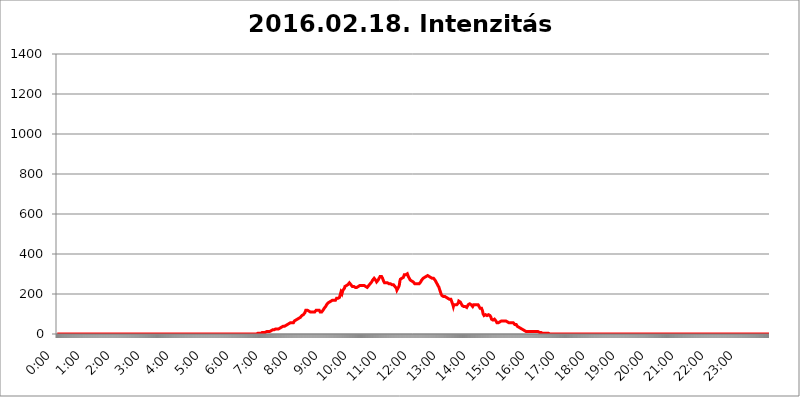
| Category | 2016.02.18. Intenzitás [W/m^2] |
|---|---|
| 0.0 | 0 |
| 0.0006944444444444445 | 0 |
| 0.001388888888888889 | 0 |
| 0.0020833333333333333 | 0 |
| 0.002777777777777778 | 0 |
| 0.003472222222222222 | 0 |
| 0.004166666666666667 | 0 |
| 0.004861111111111111 | 0 |
| 0.005555555555555556 | 0 |
| 0.0062499999999999995 | 0 |
| 0.006944444444444444 | 0 |
| 0.007638888888888889 | 0 |
| 0.008333333333333333 | 0 |
| 0.009027777777777779 | 0 |
| 0.009722222222222222 | 0 |
| 0.010416666666666666 | 0 |
| 0.011111111111111112 | 0 |
| 0.011805555555555555 | 0 |
| 0.012499999999999999 | 0 |
| 0.013194444444444444 | 0 |
| 0.013888888888888888 | 0 |
| 0.014583333333333332 | 0 |
| 0.015277777777777777 | 0 |
| 0.015972222222222224 | 0 |
| 0.016666666666666666 | 0 |
| 0.017361111111111112 | 0 |
| 0.018055555555555557 | 0 |
| 0.01875 | 0 |
| 0.019444444444444445 | 0 |
| 0.02013888888888889 | 0 |
| 0.020833333333333332 | 0 |
| 0.02152777777777778 | 0 |
| 0.022222222222222223 | 0 |
| 0.02291666666666667 | 0 |
| 0.02361111111111111 | 0 |
| 0.024305555555555556 | 0 |
| 0.024999999999999998 | 0 |
| 0.025694444444444447 | 0 |
| 0.02638888888888889 | 0 |
| 0.027083333333333334 | 0 |
| 0.027777777777777776 | 0 |
| 0.02847222222222222 | 0 |
| 0.029166666666666664 | 0 |
| 0.029861111111111113 | 0 |
| 0.030555555555555555 | 0 |
| 0.03125 | 0 |
| 0.03194444444444445 | 0 |
| 0.03263888888888889 | 0 |
| 0.03333333333333333 | 0 |
| 0.034027777777777775 | 0 |
| 0.034722222222222224 | 0 |
| 0.035416666666666666 | 0 |
| 0.036111111111111115 | 0 |
| 0.03680555555555556 | 0 |
| 0.0375 | 0 |
| 0.03819444444444444 | 0 |
| 0.03888888888888889 | 0 |
| 0.03958333333333333 | 0 |
| 0.04027777777777778 | 0 |
| 0.04097222222222222 | 0 |
| 0.041666666666666664 | 0 |
| 0.042361111111111106 | 0 |
| 0.04305555555555556 | 0 |
| 0.043750000000000004 | 0 |
| 0.044444444444444446 | 0 |
| 0.04513888888888889 | 0 |
| 0.04583333333333334 | 0 |
| 0.04652777777777778 | 0 |
| 0.04722222222222222 | 0 |
| 0.04791666666666666 | 0 |
| 0.04861111111111111 | 0 |
| 0.049305555555555554 | 0 |
| 0.049999999999999996 | 0 |
| 0.05069444444444445 | 0 |
| 0.051388888888888894 | 0 |
| 0.052083333333333336 | 0 |
| 0.05277777777777778 | 0 |
| 0.05347222222222222 | 0 |
| 0.05416666666666667 | 0 |
| 0.05486111111111111 | 0 |
| 0.05555555555555555 | 0 |
| 0.05625 | 0 |
| 0.05694444444444444 | 0 |
| 0.057638888888888885 | 0 |
| 0.05833333333333333 | 0 |
| 0.05902777777777778 | 0 |
| 0.059722222222222225 | 0 |
| 0.06041666666666667 | 0 |
| 0.061111111111111116 | 0 |
| 0.06180555555555556 | 0 |
| 0.0625 | 0 |
| 0.06319444444444444 | 0 |
| 0.06388888888888888 | 0 |
| 0.06458333333333334 | 0 |
| 0.06527777777777778 | 0 |
| 0.06597222222222222 | 0 |
| 0.06666666666666667 | 0 |
| 0.06736111111111111 | 0 |
| 0.06805555555555555 | 0 |
| 0.06874999999999999 | 0 |
| 0.06944444444444443 | 0 |
| 0.07013888888888889 | 0 |
| 0.07083333333333333 | 0 |
| 0.07152777777777779 | 0 |
| 0.07222222222222223 | 0 |
| 0.07291666666666667 | 0 |
| 0.07361111111111111 | 0 |
| 0.07430555555555556 | 0 |
| 0.075 | 0 |
| 0.07569444444444444 | 0 |
| 0.0763888888888889 | 0 |
| 0.07708333333333334 | 0 |
| 0.07777777777777778 | 0 |
| 0.07847222222222222 | 0 |
| 0.07916666666666666 | 0 |
| 0.0798611111111111 | 0 |
| 0.08055555555555556 | 0 |
| 0.08125 | 0 |
| 0.08194444444444444 | 0 |
| 0.08263888888888889 | 0 |
| 0.08333333333333333 | 0 |
| 0.08402777777777777 | 0 |
| 0.08472222222222221 | 0 |
| 0.08541666666666665 | 0 |
| 0.08611111111111112 | 0 |
| 0.08680555555555557 | 0 |
| 0.08750000000000001 | 0 |
| 0.08819444444444445 | 0 |
| 0.08888888888888889 | 0 |
| 0.08958333333333333 | 0 |
| 0.09027777777777778 | 0 |
| 0.09097222222222222 | 0 |
| 0.09166666666666667 | 0 |
| 0.09236111111111112 | 0 |
| 0.09305555555555556 | 0 |
| 0.09375 | 0 |
| 0.09444444444444444 | 0 |
| 0.09513888888888888 | 0 |
| 0.09583333333333333 | 0 |
| 0.09652777777777777 | 0 |
| 0.09722222222222222 | 0 |
| 0.09791666666666667 | 0 |
| 0.09861111111111111 | 0 |
| 0.09930555555555555 | 0 |
| 0.09999999999999999 | 0 |
| 0.10069444444444443 | 0 |
| 0.1013888888888889 | 0 |
| 0.10208333333333335 | 0 |
| 0.10277777777777779 | 0 |
| 0.10347222222222223 | 0 |
| 0.10416666666666667 | 0 |
| 0.10486111111111111 | 0 |
| 0.10555555555555556 | 0 |
| 0.10625 | 0 |
| 0.10694444444444444 | 0 |
| 0.1076388888888889 | 0 |
| 0.10833333333333334 | 0 |
| 0.10902777777777778 | 0 |
| 0.10972222222222222 | 0 |
| 0.1111111111111111 | 0 |
| 0.11180555555555556 | 0 |
| 0.11180555555555556 | 0 |
| 0.1125 | 0 |
| 0.11319444444444444 | 0 |
| 0.11388888888888889 | 0 |
| 0.11458333333333333 | 0 |
| 0.11527777777777777 | 0 |
| 0.11597222222222221 | 0 |
| 0.11666666666666665 | 0 |
| 0.1173611111111111 | 0 |
| 0.11805555555555557 | 0 |
| 0.11944444444444445 | 0 |
| 0.12013888888888889 | 0 |
| 0.12083333333333333 | 0 |
| 0.12152777777777778 | 0 |
| 0.12222222222222223 | 0 |
| 0.12291666666666667 | 0 |
| 0.12291666666666667 | 0 |
| 0.12361111111111112 | 0 |
| 0.12430555555555556 | 0 |
| 0.125 | 0 |
| 0.12569444444444444 | 0 |
| 0.12638888888888888 | 0 |
| 0.12708333333333333 | 0 |
| 0.16875 | 0 |
| 0.12847222222222224 | 0 |
| 0.12916666666666668 | 0 |
| 0.12986111111111112 | 0 |
| 0.13055555555555556 | 0 |
| 0.13125 | 0 |
| 0.13194444444444445 | 0 |
| 0.1326388888888889 | 0 |
| 0.13333333333333333 | 0 |
| 0.13402777777777777 | 0 |
| 0.13402777777777777 | 0 |
| 0.13472222222222222 | 0 |
| 0.13541666666666666 | 0 |
| 0.1361111111111111 | 0 |
| 0.13749999999999998 | 0 |
| 0.13819444444444443 | 0 |
| 0.1388888888888889 | 0 |
| 0.13958333333333334 | 0 |
| 0.14027777777777778 | 0 |
| 0.14097222222222222 | 0 |
| 0.14166666666666666 | 0 |
| 0.1423611111111111 | 0 |
| 0.14305555555555557 | 0 |
| 0.14375000000000002 | 0 |
| 0.14444444444444446 | 0 |
| 0.1451388888888889 | 0 |
| 0.1451388888888889 | 0 |
| 0.14652777777777778 | 0 |
| 0.14722222222222223 | 0 |
| 0.14791666666666667 | 0 |
| 0.1486111111111111 | 0 |
| 0.14930555555555555 | 0 |
| 0.15 | 0 |
| 0.15069444444444444 | 0 |
| 0.15138888888888888 | 0 |
| 0.15208333333333332 | 0 |
| 0.15277777777777776 | 0 |
| 0.15347222222222223 | 0 |
| 0.15416666666666667 | 0 |
| 0.15486111111111112 | 0 |
| 0.15555555555555556 | 0 |
| 0.15625 | 0 |
| 0.15694444444444444 | 0 |
| 0.15763888888888888 | 0 |
| 0.15833333333333333 | 0 |
| 0.15902777777777777 | 0 |
| 0.15972222222222224 | 0 |
| 0.16041666666666668 | 0 |
| 0.16111111111111112 | 0 |
| 0.16180555555555556 | 0 |
| 0.1625 | 0 |
| 0.16319444444444445 | 0 |
| 0.1638888888888889 | 0 |
| 0.16458333333333333 | 0 |
| 0.16527777777777777 | 0 |
| 0.16597222222222222 | 0 |
| 0.16666666666666666 | 0 |
| 0.1673611111111111 | 0 |
| 0.16805555555555554 | 0 |
| 0.16874999999999998 | 0 |
| 0.16944444444444443 | 0 |
| 0.17013888888888887 | 0 |
| 0.1708333333333333 | 0 |
| 0.17152777777777775 | 0 |
| 0.17222222222222225 | 0 |
| 0.1729166666666667 | 0 |
| 0.17361111111111113 | 0 |
| 0.17430555555555557 | 0 |
| 0.17500000000000002 | 0 |
| 0.17569444444444446 | 0 |
| 0.1763888888888889 | 0 |
| 0.17708333333333334 | 0 |
| 0.17777777777777778 | 0 |
| 0.17847222222222223 | 0 |
| 0.17916666666666667 | 0 |
| 0.1798611111111111 | 0 |
| 0.18055555555555555 | 0 |
| 0.18125 | 0 |
| 0.18194444444444444 | 0 |
| 0.1826388888888889 | 0 |
| 0.18333333333333335 | 0 |
| 0.1840277777777778 | 0 |
| 0.18472222222222223 | 0 |
| 0.18541666666666667 | 0 |
| 0.18611111111111112 | 0 |
| 0.18680555555555556 | 0 |
| 0.1875 | 0 |
| 0.18819444444444444 | 0 |
| 0.18888888888888888 | 0 |
| 0.18958333333333333 | 0 |
| 0.19027777777777777 | 0 |
| 0.1909722222222222 | 0 |
| 0.19166666666666665 | 0 |
| 0.19236111111111112 | 0 |
| 0.19305555555555554 | 0 |
| 0.19375 | 0 |
| 0.19444444444444445 | 0 |
| 0.1951388888888889 | 0 |
| 0.19583333333333333 | 0 |
| 0.19652777777777777 | 0 |
| 0.19722222222222222 | 0 |
| 0.19791666666666666 | 0 |
| 0.1986111111111111 | 0 |
| 0.19930555555555554 | 0 |
| 0.19999999999999998 | 0 |
| 0.20069444444444443 | 0 |
| 0.20138888888888887 | 0 |
| 0.2020833333333333 | 0 |
| 0.2027777777777778 | 0 |
| 0.2034722222222222 | 0 |
| 0.2041666666666667 | 0 |
| 0.20486111111111113 | 0 |
| 0.20555555555555557 | 0 |
| 0.20625000000000002 | 0 |
| 0.20694444444444446 | 0 |
| 0.2076388888888889 | 0 |
| 0.20833333333333334 | 0 |
| 0.20902777777777778 | 0 |
| 0.20972222222222223 | 0 |
| 0.21041666666666667 | 0 |
| 0.2111111111111111 | 0 |
| 0.21180555555555555 | 0 |
| 0.2125 | 0 |
| 0.21319444444444444 | 0 |
| 0.2138888888888889 | 0 |
| 0.21458333333333335 | 0 |
| 0.2152777777777778 | 0 |
| 0.21597222222222223 | 0 |
| 0.21666666666666667 | 0 |
| 0.21736111111111112 | 0 |
| 0.21805555555555556 | 0 |
| 0.21875 | 0 |
| 0.21944444444444444 | 0 |
| 0.22013888888888888 | 0 |
| 0.22083333333333333 | 0 |
| 0.22152777777777777 | 0 |
| 0.2222222222222222 | 0 |
| 0.22291666666666665 | 0 |
| 0.2236111111111111 | 0 |
| 0.22430555555555556 | 0 |
| 0.225 | 0 |
| 0.22569444444444445 | 0 |
| 0.2263888888888889 | 0 |
| 0.22708333333333333 | 0 |
| 0.22777777777777777 | 0 |
| 0.22847222222222222 | 0 |
| 0.22916666666666666 | 0 |
| 0.2298611111111111 | 0 |
| 0.23055555555555554 | 0 |
| 0.23124999999999998 | 0 |
| 0.23194444444444443 | 0 |
| 0.23263888888888887 | 0 |
| 0.2333333333333333 | 0 |
| 0.2340277777777778 | 0 |
| 0.2347222222222222 | 0 |
| 0.2354166666666667 | 0 |
| 0.23611111111111113 | 0 |
| 0.23680555555555557 | 0 |
| 0.23750000000000002 | 0 |
| 0.23819444444444446 | 0 |
| 0.2388888888888889 | 0 |
| 0.23958333333333334 | 0 |
| 0.24027777777777778 | 0 |
| 0.24097222222222223 | 0 |
| 0.24166666666666667 | 0 |
| 0.2423611111111111 | 0 |
| 0.24305555555555555 | 0 |
| 0.24375 | 0 |
| 0.24444444444444446 | 0 |
| 0.24513888888888888 | 0 |
| 0.24583333333333335 | 0 |
| 0.2465277777777778 | 0 |
| 0.24722222222222223 | 0 |
| 0.24791666666666667 | 0 |
| 0.24861111111111112 | 0 |
| 0.24930555555555556 | 0 |
| 0.25 | 0 |
| 0.25069444444444444 | 0 |
| 0.2513888888888889 | 0 |
| 0.2520833333333333 | 0 |
| 0.25277777777777777 | 0 |
| 0.2534722222222222 | 0 |
| 0.25416666666666665 | 0 |
| 0.2548611111111111 | 0 |
| 0.2555555555555556 | 0 |
| 0.25625000000000003 | 0 |
| 0.2569444444444445 | 0 |
| 0.2576388888888889 | 0 |
| 0.25833333333333336 | 0 |
| 0.2590277777777778 | 0 |
| 0.25972222222222224 | 0 |
| 0.2604166666666667 | 0 |
| 0.2611111111111111 | 0 |
| 0.26180555555555557 | 0 |
| 0.2625 | 0 |
| 0.26319444444444445 | 0 |
| 0.2638888888888889 | 0 |
| 0.26458333333333334 | 0 |
| 0.2652777777777778 | 0 |
| 0.2659722222222222 | 0 |
| 0.26666666666666666 | 0 |
| 0.2673611111111111 | 0 |
| 0.26805555555555555 | 0 |
| 0.26875 | 0 |
| 0.26944444444444443 | 0 |
| 0.2701388888888889 | 0 |
| 0.2708333333333333 | 0 |
| 0.27152777777777776 | 0 |
| 0.2722222222222222 | 0 |
| 0.27291666666666664 | 0 |
| 0.2736111111111111 | 0 |
| 0.2743055555555555 | 0 |
| 0.27499999999999997 | 0 |
| 0.27569444444444446 | 0 |
| 0.27638888888888885 | 0 |
| 0.27708333333333335 | 0 |
| 0.2777777777777778 | 0 |
| 0.27847222222222223 | 0 |
| 0.2791666666666667 | 0 |
| 0.2798611111111111 | 0 |
| 0.28055555555555556 | 3.525 |
| 0.28125 | 3.525 |
| 0.28194444444444444 | 3.525 |
| 0.2826388888888889 | 3.525 |
| 0.2833333333333333 | 3.525 |
| 0.28402777777777777 | 3.525 |
| 0.2847222222222222 | 3.525 |
| 0.28541666666666665 | 3.525 |
| 0.28611111111111115 | 3.525 |
| 0.28680555555555554 | 7.887 |
| 0.28750000000000003 | 7.887 |
| 0.2881944444444445 | 7.887 |
| 0.2888888888888889 | 7.887 |
| 0.28958333333333336 | 7.887 |
| 0.2902777777777778 | 7.887 |
| 0.29097222222222224 | 7.887 |
| 0.2916666666666667 | 7.887 |
| 0.2923611111111111 | 7.887 |
| 0.29305555555555557 | 7.887 |
| 0.29375 | 12.257 |
| 0.29444444444444445 | 12.257 |
| 0.2951388888888889 | 12.257 |
| 0.29583333333333334 | 12.257 |
| 0.2965277777777778 | 12.257 |
| 0.2972222222222222 | 12.257 |
| 0.29791666666666666 | 12.257 |
| 0.2986111111111111 | 16.636 |
| 0.29930555555555555 | 16.636 |
| 0.3 | 16.636 |
| 0.30069444444444443 | 16.636 |
| 0.3013888888888889 | 16.636 |
| 0.3020833333333333 | 21.024 |
| 0.30277777777777776 | 21.024 |
| 0.3034722222222222 | 21.024 |
| 0.30416666666666664 | 21.024 |
| 0.3048611111111111 | 25.419 |
| 0.3055555555555555 | 25.419 |
| 0.30624999999999997 | 25.419 |
| 0.3069444444444444 | 25.419 |
| 0.3076388888888889 | 25.419 |
| 0.30833333333333335 | 25.419 |
| 0.3090277777777778 | 25.419 |
| 0.30972222222222223 | 25.419 |
| 0.3104166666666667 | 25.419 |
| 0.3111111111111111 | 25.419 |
| 0.31180555555555556 | 29.823 |
| 0.3125 | 29.823 |
| 0.31319444444444444 | 29.823 |
| 0.3138888888888889 | 29.823 |
| 0.3145833333333333 | 34.234 |
| 0.31527777777777777 | 34.234 |
| 0.3159722222222222 | 34.234 |
| 0.31666666666666665 | 38.653 |
| 0.31736111111111115 | 38.653 |
| 0.31805555555555554 | 38.653 |
| 0.31875000000000003 | 38.653 |
| 0.3194444444444445 | 38.653 |
| 0.3201388888888889 | 43.079 |
| 0.32083333333333336 | 43.079 |
| 0.3215277777777778 | 43.079 |
| 0.32222222222222224 | 47.511 |
| 0.3229166666666667 | 47.511 |
| 0.3236111111111111 | 47.511 |
| 0.32430555555555557 | 51.951 |
| 0.325 | 51.951 |
| 0.32569444444444445 | 51.951 |
| 0.3263888888888889 | 56.398 |
| 0.32708333333333334 | 56.398 |
| 0.3277777777777778 | 56.398 |
| 0.3284722222222222 | 56.398 |
| 0.32916666666666666 | 56.398 |
| 0.3298611111111111 | 56.398 |
| 0.33055555555555555 | 56.398 |
| 0.33125 | 56.398 |
| 0.33194444444444443 | 60.85 |
| 0.3326388888888889 | 65.31 |
| 0.3333333333333333 | 65.31 |
| 0.3340277777777778 | 65.31 |
| 0.3347222222222222 | 69.775 |
| 0.3354166666666667 | 69.775 |
| 0.3361111111111111 | 69.775 |
| 0.3368055555555556 | 74.246 |
| 0.33749999999999997 | 74.246 |
| 0.33819444444444446 | 74.246 |
| 0.33888888888888885 | 78.722 |
| 0.33958333333333335 | 78.722 |
| 0.34027777777777773 | 83.205 |
| 0.34097222222222223 | 83.205 |
| 0.3416666666666666 | 87.692 |
| 0.3423611111111111 | 87.692 |
| 0.3430555555555555 | 92.184 |
| 0.34375 | 92.184 |
| 0.3444444444444445 | 96.682 |
| 0.3451388888888889 | 96.682 |
| 0.3458333333333334 | 101.184 |
| 0.34652777777777777 | 101.184 |
| 0.34722222222222227 | 105.69 |
| 0.34791666666666665 | 110.201 |
| 0.34861111111111115 | 119.235 |
| 0.34930555555555554 | 119.235 |
| 0.35000000000000003 | 119.235 |
| 0.3506944444444444 | 119.235 |
| 0.3513888888888889 | 119.235 |
| 0.3520833333333333 | 119.235 |
| 0.3527777777777778 | 114.716 |
| 0.3534722222222222 | 114.716 |
| 0.3541666666666667 | 110.201 |
| 0.3548611111111111 | 110.201 |
| 0.35555555555555557 | 114.716 |
| 0.35625 | 110.201 |
| 0.35694444444444445 | 110.201 |
| 0.3576388888888889 | 110.201 |
| 0.35833333333333334 | 110.201 |
| 0.3590277777777778 | 110.201 |
| 0.3597222222222222 | 110.201 |
| 0.36041666666666666 | 110.201 |
| 0.3611111111111111 | 110.201 |
| 0.36180555555555555 | 114.716 |
| 0.3625 | 114.716 |
| 0.36319444444444443 | 119.235 |
| 0.3638888888888889 | 119.235 |
| 0.3645833333333333 | 119.235 |
| 0.3652777777777778 | 119.235 |
| 0.3659722222222222 | 119.235 |
| 0.3666666666666667 | 119.235 |
| 0.3673611111111111 | 119.235 |
| 0.3680555555555556 | 114.716 |
| 0.36874999999999997 | 110.201 |
| 0.36944444444444446 | 110.201 |
| 0.37013888888888885 | 110.201 |
| 0.37083333333333335 | 110.201 |
| 0.37152777777777773 | 114.716 |
| 0.37222222222222223 | 114.716 |
| 0.3729166666666666 | 119.235 |
| 0.3736111111111111 | 123.758 |
| 0.3743055555555555 | 128.284 |
| 0.375 | 128.284 |
| 0.3756944444444445 | 132.814 |
| 0.3763888888888889 | 137.347 |
| 0.3770833333333334 | 141.884 |
| 0.37777777777777777 | 146.423 |
| 0.37847222222222227 | 146.423 |
| 0.37916666666666665 | 150.964 |
| 0.37986111111111115 | 155.509 |
| 0.38055555555555554 | 155.509 |
| 0.38125000000000003 | 160.056 |
| 0.3819444444444444 | 160.056 |
| 0.3826388888888889 | 164.605 |
| 0.3833333333333333 | 164.605 |
| 0.3840277777777778 | 164.605 |
| 0.3847222222222222 | 164.605 |
| 0.3854166666666667 | 169.156 |
| 0.3861111111111111 | 169.156 |
| 0.38680555555555557 | 169.156 |
| 0.3875 | 169.156 |
| 0.38819444444444445 | 169.156 |
| 0.3888888888888889 | 169.156 |
| 0.38958333333333334 | 169.156 |
| 0.3902777777777778 | 169.156 |
| 0.3909722222222222 | 173.709 |
| 0.39166666666666666 | 178.264 |
| 0.3923611111111111 | 182.82 |
| 0.39305555555555555 | 182.82 |
| 0.39375 | 178.264 |
| 0.39444444444444443 | 178.264 |
| 0.3951388888888889 | 182.82 |
| 0.3958333333333333 | 182.82 |
| 0.3965277777777778 | 191.937 |
| 0.3972222222222222 | 201.058 |
| 0.3979166666666667 | 210.182 |
| 0.3986111111111111 | 205.62 |
| 0.3993055555555556 | 201.058 |
| 0.39999999999999997 | 205.62 |
| 0.40069444444444446 | 219.309 |
| 0.40138888888888885 | 219.309 |
| 0.40208333333333335 | 223.873 |
| 0.40277777777777773 | 228.436 |
| 0.40347222222222223 | 237.564 |
| 0.4041666666666666 | 242.127 |
| 0.4048611111111111 | 242.127 |
| 0.4055555555555555 | 242.127 |
| 0.40625 | 242.127 |
| 0.4069444444444445 | 242.127 |
| 0.4076388888888889 | 246.689 |
| 0.4083333333333334 | 246.689 |
| 0.40902777777777777 | 251.251 |
| 0.40972222222222227 | 255.813 |
| 0.41041666666666665 | 251.251 |
| 0.41111111111111115 | 251.251 |
| 0.41180555555555554 | 246.689 |
| 0.41250000000000003 | 242.127 |
| 0.4131944444444444 | 242.127 |
| 0.4138888888888889 | 237.564 |
| 0.4145833333333333 | 242.127 |
| 0.4152777777777778 | 237.564 |
| 0.4159722222222222 | 237.564 |
| 0.4166666666666667 | 233 |
| 0.4173611111111111 | 233 |
| 0.41805555555555557 | 233 |
| 0.41875 | 233 |
| 0.41944444444444445 | 233 |
| 0.4201388888888889 | 233 |
| 0.42083333333333334 | 237.564 |
| 0.4215277777777778 | 237.564 |
| 0.4222222222222222 | 237.564 |
| 0.42291666666666666 | 237.564 |
| 0.4236111111111111 | 237.564 |
| 0.42430555555555555 | 242.127 |
| 0.425 | 242.127 |
| 0.42569444444444443 | 242.127 |
| 0.4263888888888889 | 242.127 |
| 0.4270833333333333 | 242.127 |
| 0.4277777777777778 | 242.127 |
| 0.4284722222222222 | 242.127 |
| 0.4291666666666667 | 242.127 |
| 0.4298611111111111 | 242.127 |
| 0.4305555555555556 | 242.127 |
| 0.43124999999999997 | 237.564 |
| 0.43194444444444446 | 237.564 |
| 0.43263888888888885 | 237.564 |
| 0.43333333333333335 | 237.564 |
| 0.43402777777777773 | 237.564 |
| 0.43472222222222223 | 233 |
| 0.4354166666666666 | 233 |
| 0.4361111111111111 | 233 |
| 0.4368055555555555 | 242.127 |
| 0.4375 | 242.127 |
| 0.4381944444444445 | 246.689 |
| 0.4388888888888889 | 251.251 |
| 0.4395833333333334 | 251.251 |
| 0.44027777777777777 | 255.813 |
| 0.44097222222222227 | 260.373 |
| 0.44166666666666665 | 260.373 |
| 0.44236111111111115 | 269.49 |
| 0.44305555555555554 | 269.49 |
| 0.44375000000000003 | 274.047 |
| 0.4444444444444444 | 278.603 |
| 0.4451388888888889 | 274.047 |
| 0.4458333333333333 | 274.047 |
| 0.4465277777777778 | 269.49 |
| 0.4472222222222222 | 264.932 |
| 0.4479166666666667 | 260.373 |
| 0.4486111111111111 | 260.373 |
| 0.44930555555555557 | 264.932 |
| 0.45 | 269.49 |
| 0.45069444444444445 | 269.49 |
| 0.4513888888888889 | 278.603 |
| 0.45208333333333334 | 283.156 |
| 0.4527777777777778 | 287.709 |
| 0.4534722222222222 | 287.709 |
| 0.45416666666666666 | 292.259 |
| 0.4548611111111111 | 287.709 |
| 0.45555555555555555 | 283.156 |
| 0.45625 | 278.603 |
| 0.45694444444444443 | 274.047 |
| 0.4576388888888889 | 264.932 |
| 0.4583333333333333 | 260.373 |
| 0.4590277777777778 | 255.813 |
| 0.4597222222222222 | 251.251 |
| 0.4604166666666667 | 251.251 |
| 0.4611111111111111 | 255.813 |
| 0.4618055555555556 | 255.813 |
| 0.46249999999999997 | 255.813 |
| 0.46319444444444446 | 255.813 |
| 0.46388888888888885 | 255.813 |
| 0.46458333333333335 | 255.813 |
| 0.46527777777777773 | 251.251 |
| 0.46597222222222223 | 251.251 |
| 0.4666666666666666 | 251.251 |
| 0.4673611111111111 | 251.251 |
| 0.4680555555555555 | 251.251 |
| 0.46875 | 251.251 |
| 0.4694444444444445 | 246.689 |
| 0.4701388888888889 | 246.689 |
| 0.4708333333333334 | 246.689 |
| 0.47152777777777777 | 246.689 |
| 0.47222222222222227 | 242.127 |
| 0.47291666666666665 | 242.127 |
| 0.47361111111111115 | 237.564 |
| 0.47430555555555554 | 233 |
| 0.47500000000000003 | 233 |
| 0.4756944444444444 | 228.436 |
| 0.4763888888888889 | 219.309 |
| 0.4770833333333333 | 223.873 |
| 0.4777777777777778 | 228.436 |
| 0.4784722222222222 | 228.436 |
| 0.4791666666666667 | 237.564 |
| 0.4798611111111111 | 246.689 |
| 0.48055555555555557 | 264.932 |
| 0.48125 | 274.047 |
| 0.48194444444444445 | 274.047 |
| 0.4826388888888889 | 278.603 |
| 0.48333333333333334 | 278.603 |
| 0.4840277777777778 | 278.603 |
| 0.4847222222222222 | 278.603 |
| 0.48541666666666666 | 283.156 |
| 0.4861111111111111 | 287.709 |
| 0.48680555555555555 | 296.808 |
| 0.4875 | 301.354 |
| 0.48819444444444443 | 296.808 |
| 0.4888888888888889 | 296.808 |
| 0.4895833333333333 | 296.808 |
| 0.4902777777777778 | 296.808 |
| 0.4909722222222222 | 301.354 |
| 0.4916666666666667 | 296.808 |
| 0.4923611111111111 | 287.709 |
| 0.4930555555555556 | 283.156 |
| 0.49374999999999997 | 278.603 |
| 0.49444444444444446 | 274.047 |
| 0.49513888888888885 | 269.49 |
| 0.49583333333333335 | 269.49 |
| 0.49652777777777773 | 269.49 |
| 0.49722222222222223 | 264.932 |
| 0.4979166666666666 | 260.373 |
| 0.4986111111111111 | 260.373 |
| 0.4993055555555555 | 260.373 |
| 0.5 | 255.813 |
| 0.5006944444444444 | 255.813 |
| 0.5013888888888889 | 251.251 |
| 0.5020833333333333 | 251.251 |
| 0.5027777777777778 | 251.251 |
| 0.5034722222222222 | 251.251 |
| 0.5041666666666667 | 251.251 |
| 0.5048611111111111 | 251.251 |
| 0.5055555555555555 | 251.251 |
| 0.50625 | 251.251 |
| 0.5069444444444444 | 251.251 |
| 0.5076388888888889 | 251.251 |
| 0.5083333333333333 | 251.251 |
| 0.5090277777777777 | 255.813 |
| 0.5097222222222222 | 260.373 |
| 0.5104166666666666 | 264.932 |
| 0.5111111111111112 | 269.49 |
| 0.5118055555555555 | 274.047 |
| 0.5125000000000001 | 274.047 |
| 0.5131944444444444 | 278.603 |
| 0.513888888888889 | 278.603 |
| 0.5145833333333333 | 278.603 |
| 0.5152777777777778 | 283.156 |
| 0.5159722222222222 | 283.156 |
| 0.5166666666666667 | 283.156 |
| 0.517361111111111 | 287.709 |
| 0.5180555555555556 | 287.709 |
| 0.5187499999999999 | 287.709 |
| 0.5194444444444445 | 292.259 |
| 0.5201388888888888 | 292.259 |
| 0.5208333333333334 | 287.709 |
| 0.5215277777777778 | 287.709 |
| 0.5222222222222223 | 283.156 |
| 0.5229166666666667 | 283.156 |
| 0.5236111111111111 | 283.156 |
| 0.5243055555555556 | 278.603 |
| 0.525 | 278.603 |
| 0.5256944444444445 | 278.603 |
| 0.5263888888888889 | 274.047 |
| 0.5270833333333333 | 278.603 |
| 0.5277777777777778 | 278.603 |
| 0.5284722222222222 | 274.047 |
| 0.5291666666666667 | 274.047 |
| 0.5298611111111111 | 269.49 |
| 0.5305555555555556 | 264.932 |
| 0.53125 | 260.373 |
| 0.5319444444444444 | 255.813 |
| 0.5326388888888889 | 251.251 |
| 0.5333333333333333 | 246.689 |
| 0.5340277777777778 | 242.127 |
| 0.5347222222222222 | 237.564 |
| 0.5354166666666667 | 233 |
| 0.5361111111111111 | 223.873 |
| 0.5368055555555555 | 219.309 |
| 0.5375 | 210.182 |
| 0.5381944444444444 | 201.058 |
| 0.5388888888888889 | 196.497 |
| 0.5395833333333333 | 191.937 |
| 0.5402777777777777 | 191.937 |
| 0.5409722222222222 | 187.378 |
| 0.5416666666666666 | 187.378 |
| 0.5423611111111112 | 187.378 |
| 0.5430555555555555 | 187.378 |
| 0.5437500000000001 | 187.378 |
| 0.5444444444444444 | 187.378 |
| 0.545138888888889 | 187.378 |
| 0.5458333333333333 | 182.82 |
| 0.5465277777777778 | 182.82 |
| 0.5472222222222222 | 178.264 |
| 0.5479166666666667 | 178.264 |
| 0.548611111111111 | 173.709 |
| 0.5493055555555556 | 173.709 |
| 0.5499999999999999 | 173.709 |
| 0.5506944444444445 | 173.709 |
| 0.5513888888888888 | 173.709 |
| 0.5520833333333334 | 173.709 |
| 0.5527777777777778 | 169.156 |
| 0.5534722222222223 | 160.056 |
| 0.5541666666666667 | 155.509 |
| 0.5548611111111111 | 146.423 |
| 0.5555555555555556 | 137.347 |
| 0.55625 | 146.423 |
| 0.5569444444444445 | 150.964 |
| 0.5576388888888889 | 146.423 |
| 0.5583333333333333 | 146.423 |
| 0.5590277777777778 | 146.423 |
| 0.5597222222222222 | 146.423 |
| 0.5604166666666667 | 146.423 |
| 0.5611111111111111 | 146.423 |
| 0.5618055555555556 | 150.964 |
| 0.5625 | 155.509 |
| 0.5631944444444444 | 164.605 |
| 0.5638888888888889 | 164.605 |
| 0.5645833333333333 | 164.605 |
| 0.5652777777777778 | 160.056 |
| 0.5659722222222222 | 155.509 |
| 0.5666666666666667 | 150.964 |
| 0.5673611111111111 | 146.423 |
| 0.5680555555555555 | 141.884 |
| 0.56875 | 137.347 |
| 0.5694444444444444 | 137.347 |
| 0.5701388888888889 | 137.347 |
| 0.5708333333333333 | 137.347 |
| 0.5715277777777777 | 137.347 |
| 0.5722222222222222 | 137.347 |
| 0.5729166666666666 | 137.347 |
| 0.5736111111111112 | 137.347 |
| 0.5743055555555555 | 132.814 |
| 0.5750000000000001 | 132.814 |
| 0.5756944444444444 | 137.347 |
| 0.576388888888889 | 146.423 |
| 0.5770833333333333 | 150.964 |
| 0.5777777777777778 | 150.964 |
| 0.5784722222222222 | 150.964 |
| 0.5791666666666667 | 150.964 |
| 0.579861111111111 | 150.964 |
| 0.5805555555555556 | 146.423 |
| 0.5812499999999999 | 141.884 |
| 0.5819444444444445 | 141.884 |
| 0.5826388888888888 | 137.347 |
| 0.5833333333333334 | 141.884 |
| 0.5840277777777778 | 146.423 |
| 0.5847222222222223 | 146.423 |
| 0.5854166666666667 | 146.423 |
| 0.5861111111111111 | 146.423 |
| 0.5868055555555556 | 146.423 |
| 0.5875 | 146.423 |
| 0.5881944444444445 | 146.423 |
| 0.5888888888888889 | 146.423 |
| 0.5895833333333333 | 146.423 |
| 0.5902777777777778 | 146.423 |
| 0.5909722222222222 | 141.884 |
| 0.5916666666666667 | 137.347 |
| 0.5923611111111111 | 132.814 |
| 0.5930555555555556 | 128.284 |
| 0.59375 | 132.814 |
| 0.5944444444444444 | 128.284 |
| 0.5951388888888889 | 128.284 |
| 0.5958333333333333 | 123.758 |
| 0.5965277777777778 | 114.716 |
| 0.5972222222222222 | 101.184 |
| 0.5979166666666667 | 96.682 |
| 0.5986111111111111 | 92.184 |
| 0.5993055555555555 | 92.184 |
| 0.6 | 92.184 |
| 0.6006944444444444 | 96.682 |
| 0.6013888888888889 | 96.682 |
| 0.6020833333333333 | 92.184 |
| 0.6027777777777777 | 92.184 |
| 0.6034722222222222 | 92.184 |
| 0.6041666666666666 | 92.184 |
| 0.6048611111111112 | 96.682 |
| 0.6055555555555555 | 96.682 |
| 0.6062500000000001 | 96.682 |
| 0.6069444444444444 | 92.184 |
| 0.607638888888889 | 87.692 |
| 0.6083333333333333 | 83.205 |
| 0.6090277777777778 | 74.246 |
| 0.6097222222222222 | 74.246 |
| 0.6104166666666667 | 69.775 |
| 0.611111111111111 | 69.775 |
| 0.6118055555555556 | 69.775 |
| 0.6124999999999999 | 74.246 |
| 0.6131944444444445 | 74.246 |
| 0.6138888888888888 | 74.246 |
| 0.6145833333333334 | 69.775 |
| 0.6152777777777778 | 65.31 |
| 0.6159722222222223 | 60.85 |
| 0.6166666666666667 | 56.398 |
| 0.6173611111111111 | 56.398 |
| 0.6180555555555556 | 60.85 |
| 0.61875 | 56.398 |
| 0.6194444444444445 | 56.398 |
| 0.6201388888888889 | 60.85 |
| 0.6208333333333333 | 60.85 |
| 0.6215277777777778 | 60.85 |
| 0.6222222222222222 | 60.85 |
| 0.6229166666666667 | 65.31 |
| 0.6236111111111111 | 60.85 |
| 0.6243055555555556 | 60.85 |
| 0.625 | 65.31 |
| 0.6256944444444444 | 65.31 |
| 0.6263888888888889 | 65.31 |
| 0.6270833333333333 | 65.31 |
| 0.6277777777777778 | 65.31 |
| 0.6284722222222222 | 65.31 |
| 0.6291666666666667 | 65.31 |
| 0.6298611111111111 | 65.31 |
| 0.6305555555555555 | 60.85 |
| 0.63125 | 60.85 |
| 0.6319444444444444 | 56.398 |
| 0.6326388888888889 | 56.398 |
| 0.6333333333333333 | 56.398 |
| 0.6340277777777777 | 56.398 |
| 0.6347222222222222 | 56.398 |
| 0.6354166666666666 | 56.398 |
| 0.6361111111111112 | 56.398 |
| 0.6368055555555555 | 56.398 |
| 0.6375000000000001 | 56.398 |
| 0.6381944444444444 | 56.398 |
| 0.638888888888889 | 56.398 |
| 0.6395833333333333 | 56.398 |
| 0.6402777777777778 | 51.951 |
| 0.6409722222222222 | 51.951 |
| 0.6416666666666667 | 47.511 |
| 0.642361111111111 | 47.511 |
| 0.6430555555555556 | 47.511 |
| 0.6437499999999999 | 47.511 |
| 0.6444444444444445 | 43.079 |
| 0.6451388888888888 | 38.653 |
| 0.6458333333333334 | 38.653 |
| 0.6465277777777778 | 34.234 |
| 0.6472222222222223 | 34.234 |
| 0.6479166666666667 | 29.823 |
| 0.6486111111111111 | 29.823 |
| 0.6493055555555556 | 29.823 |
| 0.65 | 25.419 |
| 0.6506944444444445 | 25.419 |
| 0.6513888888888889 | 25.419 |
| 0.6520833333333333 | 21.024 |
| 0.6527777777777778 | 21.024 |
| 0.6534722222222222 | 21.024 |
| 0.6541666666666667 | 16.636 |
| 0.6548611111111111 | 16.636 |
| 0.6555555555555556 | 16.636 |
| 0.65625 | 12.257 |
| 0.6569444444444444 | 12.257 |
| 0.6576388888888889 | 12.257 |
| 0.6583333333333333 | 12.257 |
| 0.6590277777777778 | 12.257 |
| 0.6597222222222222 | 12.257 |
| 0.6604166666666667 | 12.257 |
| 0.6611111111111111 | 12.257 |
| 0.6618055555555555 | 12.257 |
| 0.6625 | 12.257 |
| 0.6631944444444444 | 12.257 |
| 0.6638888888888889 | 12.257 |
| 0.6645833333333333 | 12.257 |
| 0.6652777777777777 | 12.257 |
| 0.6659722222222222 | 12.257 |
| 0.6666666666666666 | 12.257 |
| 0.6673611111111111 | 12.257 |
| 0.6680555555555556 | 12.257 |
| 0.6687500000000001 | 12.257 |
| 0.6694444444444444 | 12.257 |
| 0.6701388888888888 | 12.257 |
| 0.6708333333333334 | 12.257 |
| 0.6715277777777778 | 12.257 |
| 0.6722222222222222 | 12.257 |
| 0.6729166666666666 | 12.257 |
| 0.6736111111111112 | 12.257 |
| 0.6743055555555556 | 12.257 |
| 0.6749999999999999 | 7.887 |
| 0.6756944444444444 | 7.887 |
| 0.6763888888888889 | 7.887 |
| 0.6770833333333334 | 7.887 |
| 0.6777777777777777 | 7.887 |
| 0.6784722222222223 | 7.887 |
| 0.6791666666666667 | 7.887 |
| 0.6798611111111111 | 3.525 |
| 0.6805555555555555 | 3.525 |
| 0.68125 | 3.525 |
| 0.6819444444444445 | 3.525 |
| 0.6826388888888889 | 3.525 |
| 0.6833333333333332 | 3.525 |
| 0.6840277777777778 | 3.525 |
| 0.6847222222222222 | 3.525 |
| 0.6854166666666667 | 3.525 |
| 0.686111111111111 | 3.525 |
| 0.6868055555555556 | 3.525 |
| 0.6875 | 3.525 |
| 0.6881944444444444 | 3.525 |
| 0.688888888888889 | 3.525 |
| 0.6895833333333333 | 3.525 |
| 0.6902777777777778 | 0 |
| 0.6909722222222222 | 0 |
| 0.6916666666666668 | 0 |
| 0.6923611111111111 | 0 |
| 0.6930555555555555 | 0 |
| 0.69375 | 0 |
| 0.6944444444444445 | 0 |
| 0.6951388888888889 | 0 |
| 0.6958333333333333 | 0 |
| 0.6965277777777777 | 0 |
| 0.6972222222222223 | 0 |
| 0.6979166666666666 | 0 |
| 0.6986111111111111 | 0 |
| 0.6993055555555556 | 0 |
| 0.7000000000000001 | 0 |
| 0.7006944444444444 | 0 |
| 0.7013888888888888 | 0 |
| 0.7020833333333334 | 0 |
| 0.7027777777777778 | 0 |
| 0.7034722222222222 | 0 |
| 0.7041666666666666 | 0 |
| 0.7048611111111112 | 0 |
| 0.7055555555555556 | 0 |
| 0.7062499999999999 | 0 |
| 0.7069444444444444 | 0 |
| 0.7076388888888889 | 0 |
| 0.7083333333333334 | 0 |
| 0.7090277777777777 | 0 |
| 0.7097222222222223 | 0 |
| 0.7104166666666667 | 0 |
| 0.7111111111111111 | 0 |
| 0.7118055555555555 | 0 |
| 0.7125 | 0 |
| 0.7131944444444445 | 0 |
| 0.7138888888888889 | 0 |
| 0.7145833333333332 | 0 |
| 0.7152777777777778 | 0 |
| 0.7159722222222222 | 0 |
| 0.7166666666666667 | 0 |
| 0.717361111111111 | 0 |
| 0.7180555555555556 | 0 |
| 0.71875 | 0 |
| 0.7194444444444444 | 0 |
| 0.720138888888889 | 0 |
| 0.7208333333333333 | 0 |
| 0.7215277777777778 | 0 |
| 0.7222222222222222 | 0 |
| 0.7229166666666668 | 0 |
| 0.7236111111111111 | 0 |
| 0.7243055555555555 | 0 |
| 0.725 | 0 |
| 0.7256944444444445 | 0 |
| 0.7263888888888889 | 0 |
| 0.7270833333333333 | 0 |
| 0.7277777777777777 | 0 |
| 0.7284722222222223 | 0 |
| 0.7291666666666666 | 0 |
| 0.7298611111111111 | 0 |
| 0.7305555555555556 | 0 |
| 0.7312500000000001 | 0 |
| 0.7319444444444444 | 0 |
| 0.7326388888888888 | 0 |
| 0.7333333333333334 | 0 |
| 0.7340277777777778 | 0 |
| 0.7347222222222222 | 0 |
| 0.7354166666666666 | 0 |
| 0.7361111111111112 | 0 |
| 0.7368055555555556 | 0 |
| 0.7374999999999999 | 0 |
| 0.7381944444444444 | 0 |
| 0.7388888888888889 | 0 |
| 0.7395833333333334 | 0 |
| 0.7402777777777777 | 0 |
| 0.7409722222222223 | 0 |
| 0.7416666666666667 | 0 |
| 0.7423611111111111 | 0 |
| 0.7430555555555555 | 0 |
| 0.74375 | 0 |
| 0.7444444444444445 | 0 |
| 0.7451388888888889 | 0 |
| 0.7458333333333332 | 0 |
| 0.7465277777777778 | 0 |
| 0.7472222222222222 | 0 |
| 0.7479166666666667 | 0 |
| 0.748611111111111 | 0 |
| 0.7493055555555556 | 0 |
| 0.75 | 0 |
| 0.7506944444444444 | 0 |
| 0.751388888888889 | 0 |
| 0.7520833333333333 | 0 |
| 0.7527777777777778 | 0 |
| 0.7534722222222222 | 0 |
| 0.7541666666666668 | 0 |
| 0.7548611111111111 | 0 |
| 0.7555555555555555 | 0 |
| 0.75625 | 0 |
| 0.7569444444444445 | 0 |
| 0.7576388888888889 | 0 |
| 0.7583333333333333 | 0 |
| 0.7590277777777777 | 0 |
| 0.7597222222222223 | 0 |
| 0.7604166666666666 | 0 |
| 0.7611111111111111 | 0 |
| 0.7618055555555556 | 0 |
| 0.7625000000000001 | 0 |
| 0.7631944444444444 | 0 |
| 0.7638888888888888 | 0 |
| 0.7645833333333334 | 0 |
| 0.7652777777777778 | 0 |
| 0.7659722222222222 | 0 |
| 0.7666666666666666 | 0 |
| 0.7673611111111112 | 0 |
| 0.7680555555555556 | 0 |
| 0.7687499999999999 | 0 |
| 0.7694444444444444 | 0 |
| 0.7701388888888889 | 0 |
| 0.7708333333333334 | 0 |
| 0.7715277777777777 | 0 |
| 0.7722222222222223 | 0 |
| 0.7729166666666667 | 0 |
| 0.7736111111111111 | 0 |
| 0.7743055555555555 | 0 |
| 0.775 | 0 |
| 0.7756944444444445 | 0 |
| 0.7763888888888889 | 0 |
| 0.7770833333333332 | 0 |
| 0.7777777777777778 | 0 |
| 0.7784722222222222 | 0 |
| 0.7791666666666667 | 0 |
| 0.779861111111111 | 0 |
| 0.7805555555555556 | 0 |
| 0.78125 | 0 |
| 0.7819444444444444 | 0 |
| 0.782638888888889 | 0 |
| 0.7833333333333333 | 0 |
| 0.7840277777777778 | 0 |
| 0.7847222222222222 | 0 |
| 0.7854166666666668 | 0 |
| 0.7861111111111111 | 0 |
| 0.7868055555555555 | 0 |
| 0.7875 | 0 |
| 0.7881944444444445 | 0 |
| 0.7888888888888889 | 0 |
| 0.7895833333333333 | 0 |
| 0.7902777777777777 | 0 |
| 0.7909722222222223 | 0 |
| 0.7916666666666666 | 0 |
| 0.7923611111111111 | 0 |
| 0.7930555555555556 | 0 |
| 0.7937500000000001 | 0 |
| 0.7944444444444444 | 0 |
| 0.7951388888888888 | 0 |
| 0.7958333333333334 | 0 |
| 0.7965277777777778 | 0 |
| 0.7972222222222222 | 0 |
| 0.7979166666666666 | 0 |
| 0.7986111111111112 | 0 |
| 0.7993055555555556 | 0 |
| 0.7999999999999999 | 0 |
| 0.8006944444444444 | 0 |
| 0.8013888888888889 | 0 |
| 0.8020833333333334 | 0 |
| 0.8027777777777777 | 0 |
| 0.8034722222222223 | 0 |
| 0.8041666666666667 | 0 |
| 0.8048611111111111 | 0 |
| 0.8055555555555555 | 0 |
| 0.80625 | 0 |
| 0.8069444444444445 | 0 |
| 0.8076388888888889 | 0 |
| 0.8083333333333332 | 0 |
| 0.8090277777777778 | 0 |
| 0.8097222222222222 | 0 |
| 0.8104166666666667 | 0 |
| 0.811111111111111 | 0 |
| 0.8118055555555556 | 0 |
| 0.8125 | 0 |
| 0.8131944444444444 | 0 |
| 0.813888888888889 | 0 |
| 0.8145833333333333 | 0 |
| 0.8152777777777778 | 0 |
| 0.8159722222222222 | 0 |
| 0.8166666666666668 | 0 |
| 0.8173611111111111 | 0 |
| 0.8180555555555555 | 0 |
| 0.81875 | 0 |
| 0.8194444444444445 | 0 |
| 0.8201388888888889 | 0 |
| 0.8208333333333333 | 0 |
| 0.8215277777777777 | 0 |
| 0.8222222222222223 | 0 |
| 0.8229166666666666 | 0 |
| 0.8236111111111111 | 0 |
| 0.8243055555555556 | 0 |
| 0.8250000000000001 | 0 |
| 0.8256944444444444 | 0 |
| 0.8263888888888888 | 0 |
| 0.8270833333333334 | 0 |
| 0.8277777777777778 | 0 |
| 0.8284722222222222 | 0 |
| 0.8291666666666666 | 0 |
| 0.8298611111111112 | 0 |
| 0.8305555555555556 | 0 |
| 0.8312499999999999 | 0 |
| 0.8319444444444444 | 0 |
| 0.8326388888888889 | 0 |
| 0.8333333333333334 | 0 |
| 0.8340277777777777 | 0 |
| 0.8347222222222223 | 0 |
| 0.8354166666666667 | 0 |
| 0.8361111111111111 | 0 |
| 0.8368055555555555 | 0 |
| 0.8375 | 0 |
| 0.8381944444444445 | 0 |
| 0.8388888888888889 | 0 |
| 0.8395833333333332 | 0 |
| 0.8402777777777778 | 0 |
| 0.8409722222222222 | 0 |
| 0.8416666666666667 | 0 |
| 0.842361111111111 | 0 |
| 0.8430555555555556 | 0 |
| 0.84375 | 0 |
| 0.8444444444444444 | 0 |
| 0.845138888888889 | 0 |
| 0.8458333333333333 | 0 |
| 0.8465277777777778 | 0 |
| 0.8472222222222222 | 0 |
| 0.8479166666666668 | 0 |
| 0.8486111111111111 | 0 |
| 0.8493055555555555 | 0 |
| 0.85 | 0 |
| 0.8506944444444445 | 0 |
| 0.8513888888888889 | 0 |
| 0.8520833333333333 | 0 |
| 0.8527777777777777 | 0 |
| 0.8534722222222223 | 0 |
| 0.8541666666666666 | 0 |
| 0.8548611111111111 | 0 |
| 0.8555555555555556 | 0 |
| 0.8562500000000001 | 0 |
| 0.8569444444444444 | 0 |
| 0.8576388888888888 | 0 |
| 0.8583333333333334 | 0 |
| 0.8590277777777778 | 0 |
| 0.8597222222222222 | 0 |
| 0.8604166666666666 | 0 |
| 0.8611111111111112 | 0 |
| 0.8618055555555556 | 0 |
| 0.8624999999999999 | 0 |
| 0.8631944444444444 | 0 |
| 0.8638888888888889 | 0 |
| 0.8645833333333334 | 0 |
| 0.8652777777777777 | 0 |
| 0.8659722222222223 | 0 |
| 0.8666666666666667 | 0 |
| 0.8673611111111111 | 0 |
| 0.8680555555555555 | 0 |
| 0.86875 | 0 |
| 0.8694444444444445 | 0 |
| 0.8701388888888889 | 0 |
| 0.8708333333333332 | 0 |
| 0.8715277777777778 | 0 |
| 0.8722222222222222 | 0 |
| 0.8729166666666667 | 0 |
| 0.873611111111111 | 0 |
| 0.8743055555555556 | 0 |
| 0.875 | 0 |
| 0.8756944444444444 | 0 |
| 0.876388888888889 | 0 |
| 0.8770833333333333 | 0 |
| 0.8777777777777778 | 0 |
| 0.8784722222222222 | 0 |
| 0.8791666666666668 | 0 |
| 0.8798611111111111 | 0 |
| 0.8805555555555555 | 0 |
| 0.88125 | 0 |
| 0.8819444444444445 | 0 |
| 0.8826388888888889 | 0 |
| 0.8833333333333333 | 0 |
| 0.8840277777777777 | 0 |
| 0.8847222222222223 | 0 |
| 0.8854166666666666 | 0 |
| 0.8861111111111111 | 0 |
| 0.8868055555555556 | 0 |
| 0.8875000000000001 | 0 |
| 0.8881944444444444 | 0 |
| 0.8888888888888888 | 0 |
| 0.8895833333333334 | 0 |
| 0.8902777777777778 | 0 |
| 0.8909722222222222 | 0 |
| 0.8916666666666666 | 0 |
| 0.8923611111111112 | 0 |
| 0.8930555555555556 | 0 |
| 0.8937499999999999 | 0 |
| 0.8944444444444444 | 0 |
| 0.8951388888888889 | 0 |
| 0.8958333333333334 | 0 |
| 0.8965277777777777 | 0 |
| 0.8972222222222223 | 0 |
| 0.8979166666666667 | 0 |
| 0.8986111111111111 | 0 |
| 0.8993055555555555 | 0 |
| 0.9 | 0 |
| 0.9006944444444445 | 0 |
| 0.9013888888888889 | 0 |
| 0.9020833333333332 | 0 |
| 0.9027777777777778 | 0 |
| 0.9034722222222222 | 0 |
| 0.9041666666666667 | 0 |
| 0.904861111111111 | 0 |
| 0.9055555555555556 | 0 |
| 0.90625 | 0 |
| 0.9069444444444444 | 0 |
| 0.907638888888889 | 0 |
| 0.9083333333333333 | 0 |
| 0.9090277777777778 | 0 |
| 0.9097222222222222 | 0 |
| 0.9104166666666668 | 0 |
| 0.9111111111111111 | 0 |
| 0.9118055555555555 | 0 |
| 0.9125 | 0 |
| 0.9131944444444445 | 0 |
| 0.9138888888888889 | 0 |
| 0.9145833333333333 | 0 |
| 0.9152777777777777 | 0 |
| 0.9159722222222223 | 0 |
| 0.9166666666666666 | 0 |
| 0.9173611111111111 | 0 |
| 0.9180555555555556 | 0 |
| 0.9187500000000001 | 0 |
| 0.9194444444444444 | 0 |
| 0.9201388888888888 | 0 |
| 0.9208333333333334 | 0 |
| 0.9215277777777778 | 0 |
| 0.9222222222222222 | 0 |
| 0.9229166666666666 | 0 |
| 0.9236111111111112 | 0 |
| 0.9243055555555556 | 0 |
| 0.9249999999999999 | 0 |
| 0.9256944444444444 | 0 |
| 0.9263888888888889 | 0 |
| 0.9270833333333334 | 0 |
| 0.9277777777777777 | 0 |
| 0.9284722222222223 | 0 |
| 0.9291666666666667 | 0 |
| 0.9298611111111111 | 0 |
| 0.9305555555555555 | 0 |
| 0.93125 | 0 |
| 0.9319444444444445 | 0 |
| 0.9326388888888889 | 0 |
| 0.9333333333333332 | 0 |
| 0.9340277777777778 | 0 |
| 0.9347222222222222 | 0 |
| 0.9354166666666667 | 0 |
| 0.936111111111111 | 0 |
| 0.9368055555555556 | 0 |
| 0.9375 | 0 |
| 0.9381944444444444 | 0 |
| 0.938888888888889 | 0 |
| 0.9395833333333333 | 0 |
| 0.9402777777777778 | 0 |
| 0.9409722222222222 | 0 |
| 0.9416666666666668 | 0 |
| 0.9423611111111111 | 0 |
| 0.9430555555555555 | 0 |
| 0.94375 | 0 |
| 0.9444444444444445 | 0 |
| 0.9451388888888889 | 0 |
| 0.9458333333333333 | 0 |
| 0.9465277777777777 | 0 |
| 0.9472222222222223 | 0 |
| 0.9479166666666666 | 0 |
| 0.9486111111111111 | 0 |
| 0.9493055555555556 | 0 |
| 0.9500000000000001 | 0 |
| 0.9506944444444444 | 0 |
| 0.9513888888888888 | 0 |
| 0.9520833333333334 | 0 |
| 0.9527777777777778 | 0 |
| 0.9534722222222222 | 0 |
| 0.9541666666666666 | 0 |
| 0.9548611111111112 | 0 |
| 0.9555555555555556 | 0 |
| 0.9562499999999999 | 0 |
| 0.9569444444444444 | 0 |
| 0.9576388888888889 | 0 |
| 0.9583333333333334 | 0 |
| 0.9590277777777777 | 0 |
| 0.9597222222222223 | 0 |
| 0.9604166666666667 | 0 |
| 0.9611111111111111 | 0 |
| 0.9618055555555555 | 0 |
| 0.9625 | 0 |
| 0.9631944444444445 | 0 |
| 0.9638888888888889 | 0 |
| 0.9645833333333332 | 0 |
| 0.9652777777777778 | 0 |
| 0.9659722222222222 | 0 |
| 0.9666666666666667 | 0 |
| 0.967361111111111 | 0 |
| 0.9680555555555556 | 0 |
| 0.96875 | 0 |
| 0.9694444444444444 | 0 |
| 0.970138888888889 | 0 |
| 0.9708333333333333 | 0 |
| 0.9715277777777778 | 0 |
| 0.9722222222222222 | 0 |
| 0.9729166666666668 | 0 |
| 0.9736111111111111 | 0 |
| 0.9743055555555555 | 0 |
| 0.975 | 0 |
| 0.9756944444444445 | 0 |
| 0.9763888888888889 | 0 |
| 0.9770833333333333 | 0 |
| 0.9777777777777777 | 0 |
| 0.9784722222222223 | 0 |
| 0.9791666666666666 | 0 |
| 0.9798611111111111 | 0 |
| 0.9805555555555556 | 0 |
| 0.9812500000000001 | 0 |
| 0.9819444444444444 | 0 |
| 0.9826388888888888 | 0 |
| 0.9833333333333334 | 0 |
| 0.9840277777777778 | 0 |
| 0.9847222222222222 | 0 |
| 0.9854166666666666 | 0 |
| 0.9861111111111112 | 0 |
| 0.9868055555555556 | 0 |
| 0.9874999999999999 | 0 |
| 0.9881944444444444 | 0 |
| 0.9888888888888889 | 0 |
| 0.9895833333333334 | 0 |
| 0.9902777777777777 | 0 |
| 0.9909722222222223 | 0 |
| 0.9916666666666667 | 0 |
| 0.9923611111111111 | 0 |
| 0.9930555555555555 | 0 |
| 0.99375 | 0 |
| 0.9944444444444445 | 0 |
| 0.9951388888888889 | 0 |
| 0.9958333333333332 | 0 |
| 0.9965277777777778 | 0 |
| 0.9972222222222222 | 0 |
| 0.9979166666666667 | 0 |
| 0.998611111111111 | 0 |
| 0.9993055555555556 | 0 |